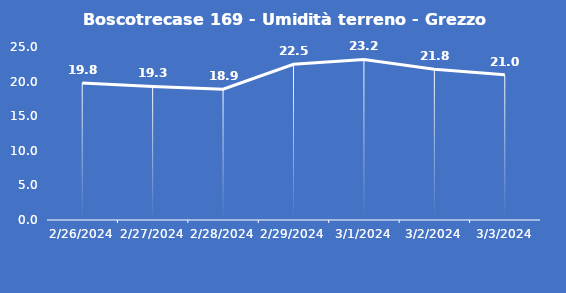
| Category | Boscotrecase 169 - Umidità terreno - Grezzo (%VWC) |
|---|---|
| 2/26/24 | 19.8 |
| 2/27/24 | 19.3 |
| 2/28/24 | 18.9 |
| 2/29/24 | 22.5 |
| 3/1/24 | 23.2 |
| 3/2/24 | 21.8 |
| 3/3/24 | 21 |